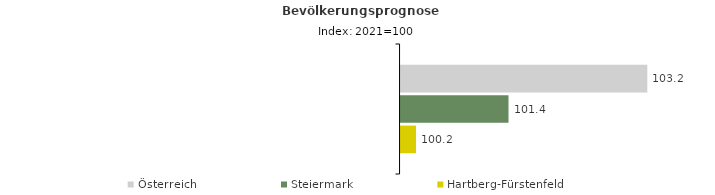
| Category | Österreich | Steiermark | Hartberg-Fürstenfeld |
|---|---|---|---|
| 2021.0 | 103.2 | 101.4 | 100.2 |